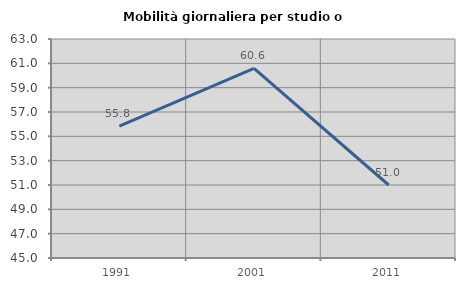
| Category | Mobilità giornaliera per studio o lavoro |
|---|---|
| 1991.0 | 55.833 |
| 2001.0 | 60.577 |
| 2011.0 | 51 |